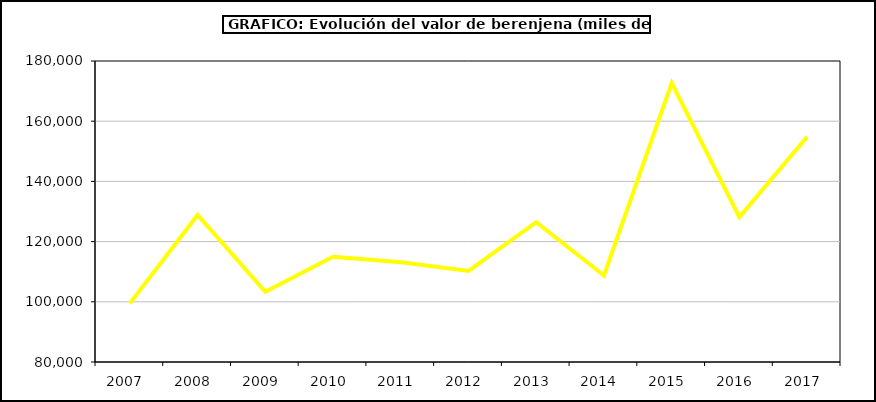
| Category | Valor |
|---|---|
| 2007.0 | 99479.743 |
| 2008.0 | 128841.418 |
| 2009.0 | 103302.87 |
| 2010.0 | 114934.838 |
| 2011.0 | 113149.264 |
| 2012.0 | 110271.616 |
| 2013.0 | 126461.496 |
| 2014.0 | 108753.977 |
| 2015.0 | 172694 |
| 2016.0 | 128140 |
| 2017.0 | 154840.085 |